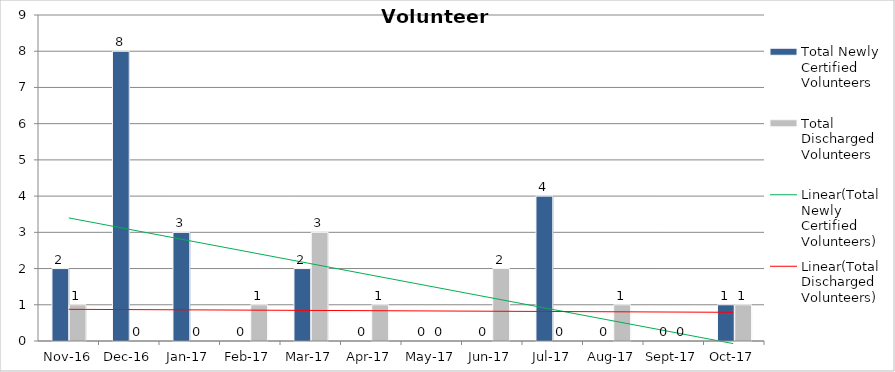
| Category | Total Newly Certified Volunteers | Total Discharged Volunteers |
|---|---|---|
| 2016-11-01 | 2 | 1 |
| 2016-12-01 | 8 | 0 |
| 2017-01-01 | 3 | 0 |
| 2017-02-01 | 0 | 1 |
| 2017-03-01 | 2 | 3 |
| 2017-04-01 | 0 | 1 |
| 2017-05-01 | 0 | 0 |
| 2017-06-01 | 0 | 2 |
| 2017-07-01 | 4 | 0 |
| 2017-08-01 | 0 | 1 |
| 2017-09-01 | 0 | 0 |
| 2017-10-01 | 1 | 1 |